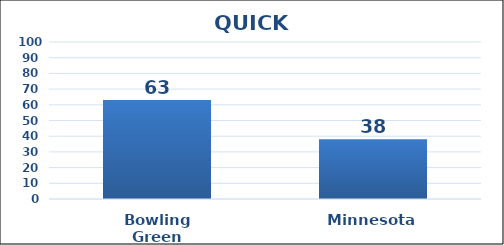
| Category | Series 0 |
|---|---|
| Bowling Green | 63 |
| Minnesota | 38 |